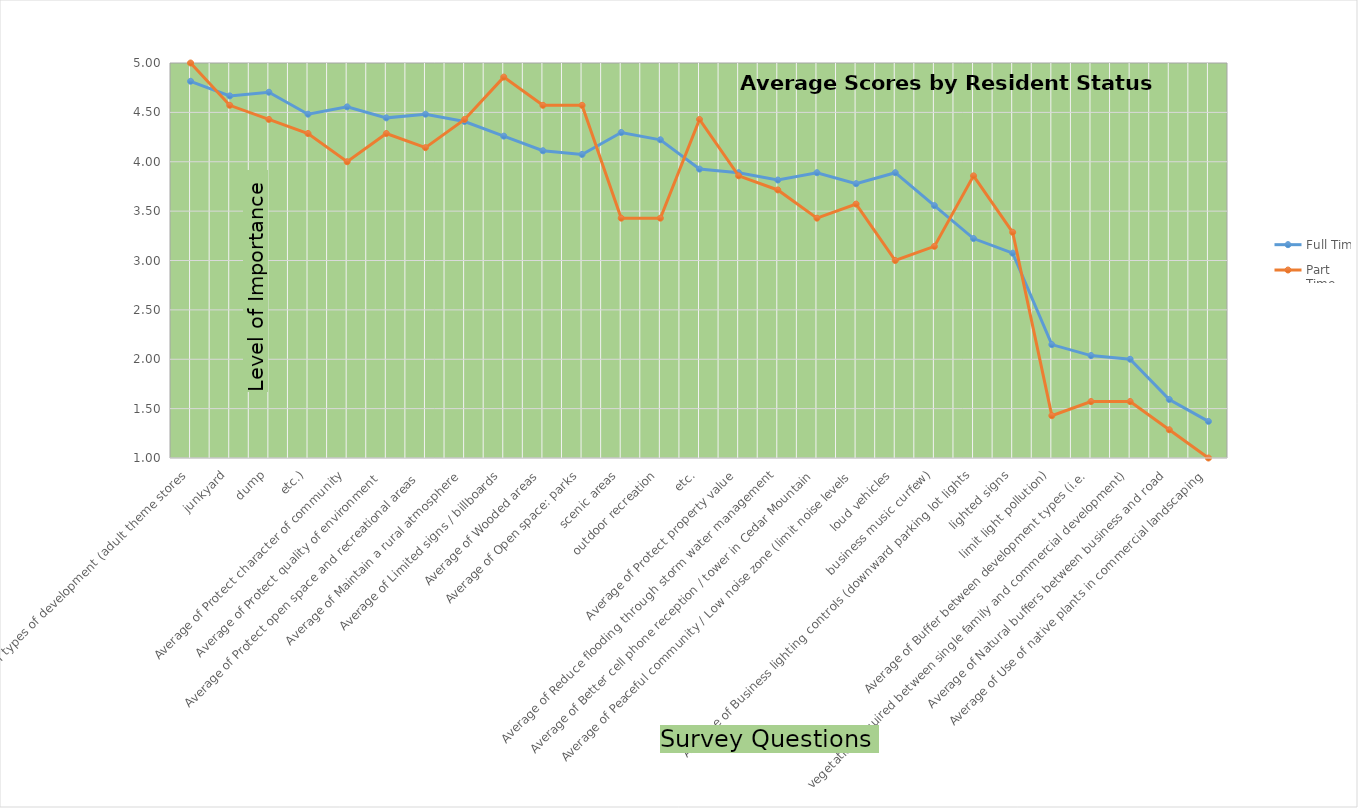
| Category | Full Time | Part Time |
|---|---|---|
| Average of Protect against certain types of development (adult theme stores, junkyard, dump, etc.) | 4.815 | 5 |
| Average of Protect character of community | 4.667 | 4.571 |
| Average of Protect quality of environment  | 4.704 | 4.429 |
| Average of Protect open space and recreational areas  | 4.481 | 4.286 |
| Average of Maintain a rural atmosphere | 4.556 | 4 |
| Average of Limited signs / billboards | 4.444 | 4.286 |
| Average of Wooded areas | 4.481 | 4.143 |
| Average of Open space: parks, scenic areas, outdoor recreation, etc. | 4.407 | 4.429 |
| Average of Protect property value | 4.259 | 4.857 |
| Average of Reduce flooding through storm water management | 4.111 | 4.571 |
| Average of Better cell phone reception / tower in Cedar Mountain | 4.074 | 4.571 |
| Average of Peaceful community / Low noise zone (limit noise levels, loud vehicles, business music curfew) | 4.296 | 3.429 |
| Average of Business lighting controls (downward parking lot lights, lighted signs, limit light pollution) | 4.222 | 3.429 |
| Average of Buffer between development types (i.e., vegetation required between single family and commercial development) | 3.926 | 4.429 |
| Average of Natural buffers between business and road | 3.889 | 3.857 |
| Average of Use of native plants in commercial landscaping | 3.815 | 3.714 |
| Average of Areas of open land | 3.889 | 3.429 |
| Average of Farming / Pasture lands | 3.778 | 3.571 |
| Average of Single Family Residential development | 3.889 | 3 |
| Average of Limit number of entrances / exits onto highway from business | 3.556 | 3.143 |
| Average of Community website | 3.222 | 3.857 |
| Average of Establish historic district | 3.074 | 3.286 |
| Average of Professional Office development | 2.148 | 1.429 |
| Average of Commercial development | 2.037 | 1.571 |
| Average of Multi-family Residential development | 2 | 1.571 |
| Average of Add traffic light at intersection of Cascade Lake and Hwy 276 | 1.593 | 1.286 |
| Average of Industrial development | 1.37 | 1 |